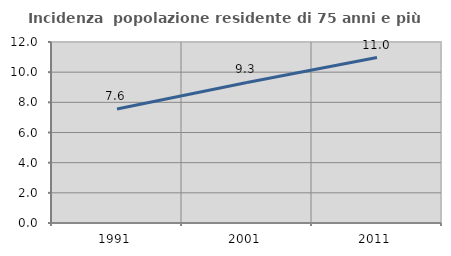
| Category | Incidenza  popolazione residente di 75 anni e più |
|---|---|
| 1991.0 | 7.558 |
| 2001.0 | 9.318 |
| 2011.0 | 10.969 |